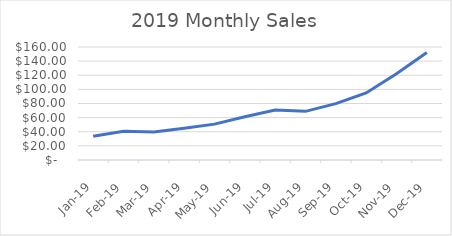
| Category | Sales |
|---|---|
| 2019-01-01 | 33.68 |
| 2019-02-01 | 40.68 |
| 2019-03-01 | 39.68 |
| 2019-04-01 | 44.96 |
| 2019-05-01 | 50.8 |
| 2019-06-01 | 61.29 |
| 2019-07-01 | 70.65 |
| 2019-08-01 | 68.88 |
| 2019-09-01 | 79.84 |
| 2019-10-01 | 94.96 |
| 2019-11-01 | 122.13 |
| 2019-12-01 | 152.1 |